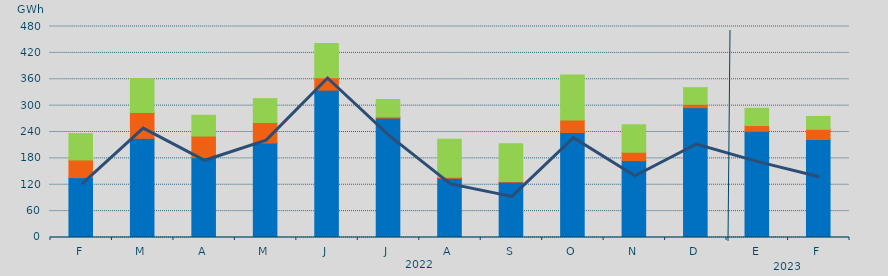
| Category | Asignación SEPE | Asignación Francia | Asignación Portugal |
|---|---|---|---|
| F | 136191.8 | 40226.7 | 59973 |
| M | 225622.7 | 58889.7 | 77145.2 |
| A | 181585.4 | 49218 | 47192.7 |
| M | 214905.3 | 46679.2 | 54371.7 |
| J | 335176.8 | 28179 | 77960.7 |
| J | 271567.05 | 2839.1 | 39441.4 |
| A | 134609.35 | 2385 | 86328.9 |
| S | 125828.7 | 1385 | 85885 |
| O | 238619.175 | 28420.1 | 102571.3 |
| N | 174742.7 | 19231.9 | 62469.6 |
| D | 295334.825 | 7715.1 | 37807.2 |
| E | 241649.025 | 13030.5 | 39359.9 |
| F | 222841.2 | 23234.4 | 29375.8 |